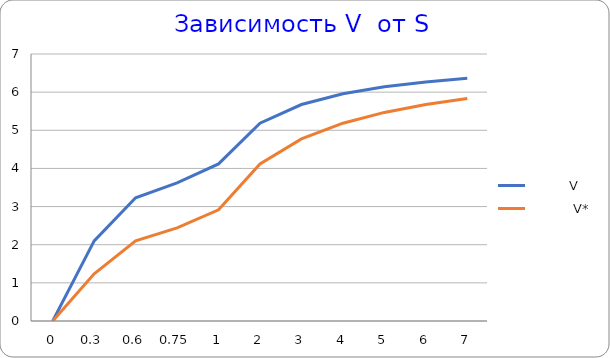
| Category |           V |            V* |
|---|---|---|
| 0.0 | 0 | 0 |
| 0.3 | 2.1 | 1.235 |
| 0.6 | 3.231 | 2.1 |
| 0.75 | 3.621 | 2.442 |
| 1.0 | 4.118 | 2.917 |
| 2.0 | 5.185 | 4.118 |
| 3.0 | 5.676 | 4.773 |
| 4.0 | 5.957 | 5.185 |
| 5.0 | 6.14 | 5.469 |
| 6.0 | 6.269 | 5.676 |
| 7.0 | 6.364 | 5.833 |